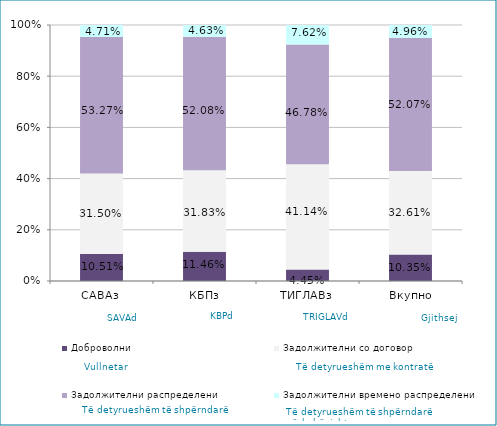
| Category | Доброволни  | Задолжителни со договор  | Задолжителни распределени  | Задолжителни времено распределени  |
|---|---|---|---|---|
| САВАз | 0.105 | 0.315 | 0.533 | 0.047 |
| КБПз | 0.115 | 0.318 | 0.521 | 0.046 |
| ТИГЛАВз | 0.045 | 0.411 | 0.468 | 0.076 |
| Вкупно | 0.104 | 0.326 | 0.521 | 0.05 |